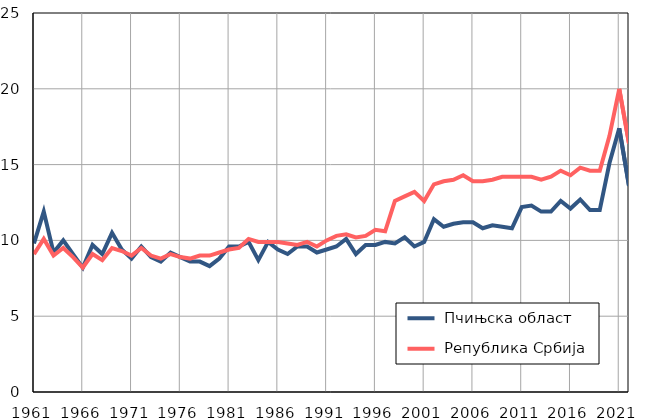
| Category |  Пчињска област |  Република Србија |
|---|---|---|
| 1961.0 | 9.8 | 9.1 |
| 1962.0 | 11.9 | 10.1 |
| 1963.0 | 9.2 | 9 |
| 1964.0 | 10 | 9.5 |
| 1965.0 | 9.1 | 8.9 |
| 1966.0 | 8.2 | 8.2 |
| 1967.0 | 9.7 | 9.1 |
| 1968.0 | 9.1 | 8.7 |
| 1969.0 | 10.5 | 9.5 |
| 1970.0 | 9.4 | 9.3 |
| 1971.0 | 8.8 | 9 |
| 1972.0 | 9.6 | 9.5 |
| 1973.0 | 8.9 | 9 |
| 1974.0 | 8.6 | 8.8 |
| 1975.0 | 9.2 | 9.1 |
| 1976.0 | 8.9 | 8.9 |
| 1977.0 | 8.6 | 8.8 |
| 1978.0 | 8.6 | 9 |
| 1979.0 | 8.3 | 9 |
| 1980.0 | 8.8 | 9.2 |
| 1981.0 | 9.6 | 9.4 |
| 1982.0 | 9.6 | 9.5 |
| 1983.0 | 9.9 | 10.1 |
| 1984.0 | 8.7 | 9.9 |
| 1985.0 | 9.9 | 9.9 |
| 1986.0 | 9.4 | 9.9 |
| 1987.0 | 9.1 | 9.8 |
| 1988.0 | 9.6 | 9.7 |
| 1989.0 | 9.6 | 9.9 |
| 1990.0 | 9.2 | 9.6 |
| 1991.0 | 9.4 | 10 |
| 1992.0 | 9.6 | 10.3 |
| 1993.0 | 10.1 | 10.4 |
| 1994.0 | 9.1 | 10.2 |
| 1995.0 | 9.7 | 10.3 |
| 1996.0 | 9.7 | 10.7 |
| 1997.0 | 9.9 | 10.6 |
| 1998.0 | 9.8 | 12.6 |
| 1999.0 | 10.2 | 12.9 |
| 2000.0 | 9.6 | 13.2 |
| 2001.0 | 9.9 | 12.6 |
| 2002.0 | 11.4 | 13.7 |
| 2003.0 | 10.9 | 13.9 |
| 2004.0 | 11.1 | 14 |
| 2005.0 | 11.2 | 14.3 |
| 2006.0 | 11.2 | 13.9 |
| 2007.0 | 10.8 | 13.9 |
| 2008.0 | 11 | 14 |
| 2009.0 | 10.9 | 14.2 |
| 2010.0 | 10.8 | 14.2 |
| 2011.0 | 12.2 | 14.2 |
| 2012.0 | 12.3 | 14.2 |
| 2013.0 | 11.9 | 14 |
| 2014.0 | 11.9 | 14.2 |
| 2015.0 | 12.6 | 14.6 |
| 2016.0 | 12.1 | 14.3 |
| 2017.0 | 12.7 | 14.8 |
| 2018.0 | 12 | 14.6 |
| 2019.0 | 12 | 14.6 |
| 2020.0 | 15.1 | 16.9 |
| 2021.0 | 17.4 | 20 |
| 2022.0 | 13.6 | 16.4 |